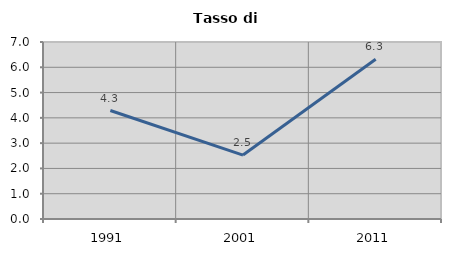
| Category | Tasso di disoccupazione   |
|---|---|
| 1991.0 | 4.289 |
| 2001.0 | 2.529 |
| 2011.0 | 6.32 |